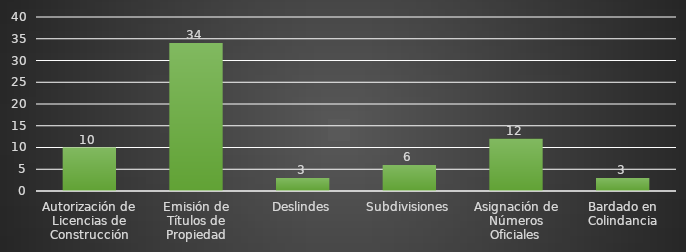
| Category | INDICADOR  |
|---|---|
| Autorización de Licencias de Construcción | 10 |
| Emisión de Títulos de Propiedad | 34 |
| Deslindes | 3 |
| Subdivisiones | 6 |
| Asignación de Números Oficiales | 12 |
| Bardado en Colindancia | 3 |